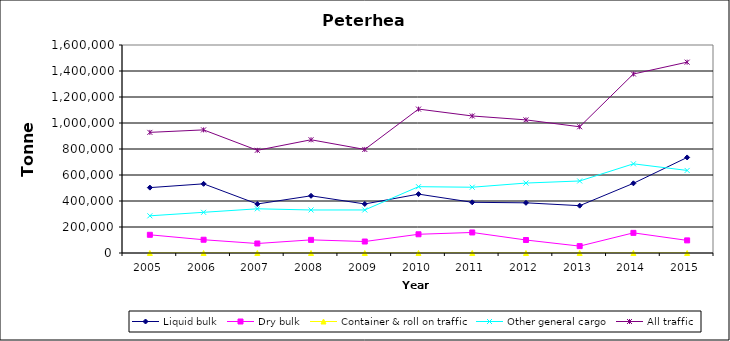
| Category | Liquid bulk | Dry bulk | Container & roll on traffic | Other general cargo | All traffic |
|---|---|---|---|---|---|
| 2005.0 | 503000 | 140000 | 0 | 286000 | 928000 |
| 2006.0 | 532000 | 102000 | 0 | 313000 | 947000 |
| 2007.0 | 377000 | 73000 | 0 | 340000 | 790000 |
| 2008.0 | 440000 | 101000 | 0 | 331000 | 871000 |
| 2009.0 | 377249 | 88298 | 0 | 331033 | 796580 |
| 2010.0 | 453000 | 144000 | 0 | 510000 | 1107000 |
| 2011.0 | 390000 | 158000 | 0 | 506000 | 1054000 |
| 2012.0 | 386000 | 100000 | 0 | 538000 | 1024000 |
| 2013.0 | 364000 | 53000 | 0 | 554000 | 971000 |
| 2014.0 | 536000 | 155000 | 0 | 686000 | 1377000 |
| 2015.0 | 735000 | 97000 | 0 | 635000 | 1468000 |